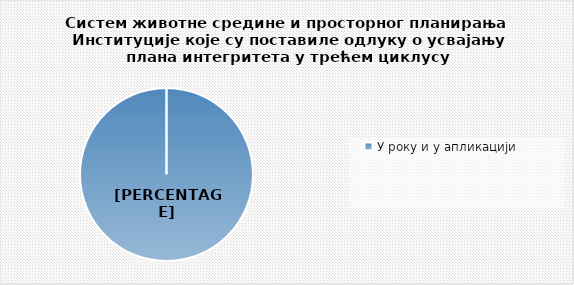
| Category | Series 0 |
|---|---|
| У року и у апликацији | 1 |
| Одлука није постављена у апликацији | 0 |